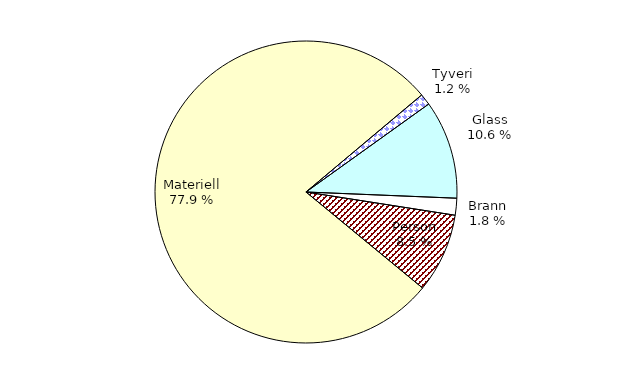
| Category | Series 0 |
|---|---|
| Tyveri | 93.279 |
| Glass | 812.754 |
| Brann | 139.063 |
| Person | 654.664 |
| Materiell | 5999.111 |